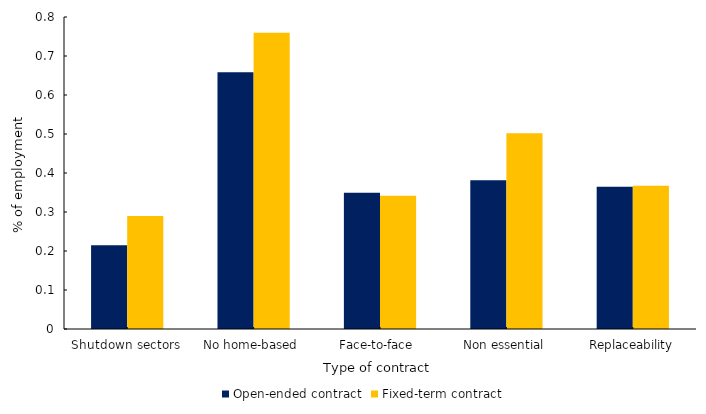
| Category | Open-ended contract | Fixed-term contract |
|---|---|---|
| Shutdown sectors | 0.215 | 0.29 |
| No home-based  | 0.658 | 0.76 |
| Face-to-face  | 0.349 | 0.342 |
| Non essential | 0.381 | 0.502 |
| Replaceability | 0.365 | 0.368 |